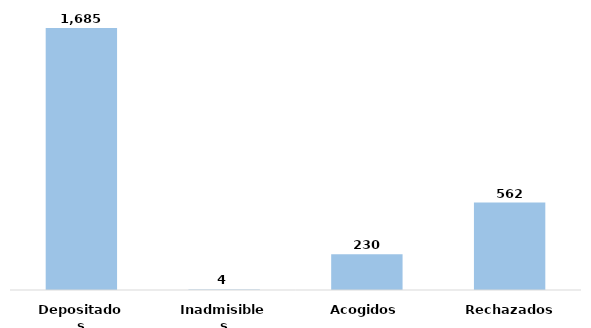
| Category | Series 0 |
|---|---|
| Depositados | 1685 |
| Inadmisibles | 4 |
| Acogidos | 230 |
| Rechazados | 562 |